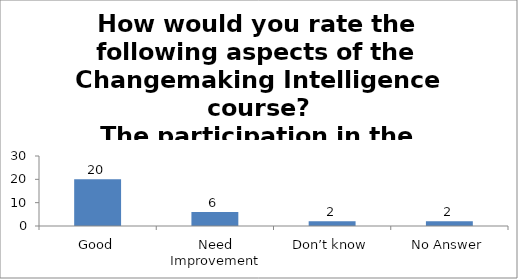
| Category | How would you rate the following aspects of the Changemaking Intelligence course?
The participation in the Changemaking Intelligence Test as a team. |
|---|---|
| Good | 20 |
| Need Improvement | 6 |
| Don’t know | 2 |
| No Answer | 2 |